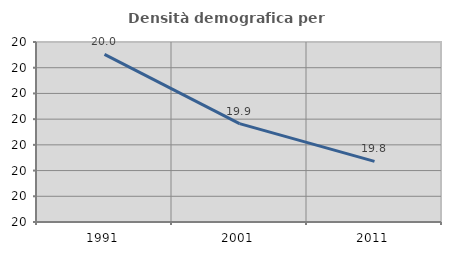
| Category | Densità demografica |
|---|---|
| 1991.0 | 20.026 |
| 2001.0 | 19.891 |
| 2011.0 | 19.818 |